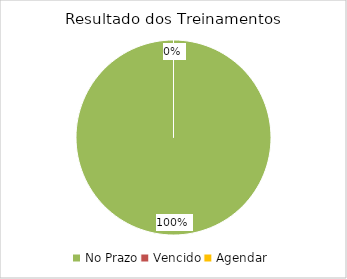
| Category | Total |
|---|---|
| No Prazo | 1 |
| Vencido | 0 |
| Agendar | 0 |